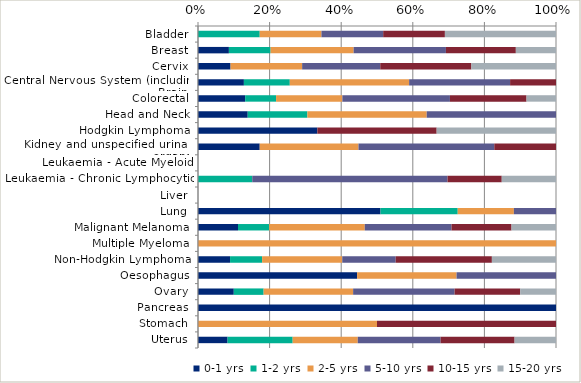
| Category | 0-1 yrs | 1-2 yrs | 2-5 yrs | 5-10 yrs | 10-15 yrs | 15-20 yrs |
|---|---|---|---|---|---|---|
| Bladder | 0 | 0.172 | 0.172 | 0.172 | 0.172 | 0.31 |
| Breast | 0.086 | 0.117 | 0.232 | 0.258 | 0.195 | 0.112 |
| Cervix | 0.091 | 0 | 0.2 | 0.218 | 0.255 | 0.236 |
| Central Nervous System (including Brain) | 0.128 | 0.128 | 0.333 | 0.282 | 0.128 | 0 |
| Colorectal | 0.132 | 0.086 | 0.185 | 0.3 | 0.214 | 0.082 |
| Head and Neck | 0.139 | 0.167 | 0.333 | 0.361 | 0 | 0 |
| Hodgkin Lymphoma | 0.333 | 0 | 0 | 0 | 0.333 | 0.333 |
| Kidney and unspecified urinary organs | 0.172 | 0 | 0.276 | 0.379 | 0.172 | 0 |
| Leukaemia - Acute Myeloid | 0 | 0 | 0 | 0 | 0 | 0 |
| Leukaemia - Chronic Lymphocytic | 0 | 0.152 | 0 | 0.545 | 0.152 | 0.152 |
| Liver | 0 | 0 | 0 | 0 | 0 | 0 |
| Lung | 0.51 | 0.216 | 0.157 | 0.118 | 0 | 0 |
| Malignant Melanoma | 0.112 | 0.087 | 0.267 | 0.242 | 0.168 | 0.124 |
| Multiple Myeloma | 0 | 0 | 1 | 0 | 0 | 0 |
| Non-Hodgkin Lymphoma | 0.09 | 0.09 | 0.224 | 0.149 | 0.269 | 0.179 |
| Oesophagus | 0.444 | 0 | 0.278 | 0.278 | 0 | 0 |
| Ovary | 0.1 | 0.083 | 0.25 | 0.283 | 0.183 | 0.1 |
| Pancreas | 1 | 0 | 0 | 0 | 0 | 0 |
| Stomach | 0 | 0 | 0.5 | 0 | 0.5 | 0 |
| Uterus | 0.083 | 0.182 | 0.182 | 0.231 | 0.207 | 0.116 |